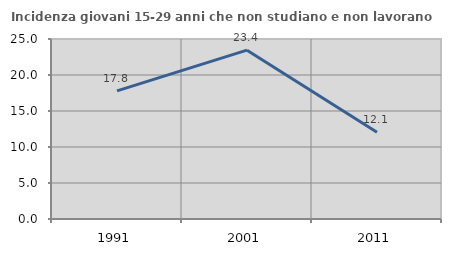
| Category | Incidenza giovani 15-29 anni che non studiano e non lavorano  |
|---|---|
| 1991.0 | 17.79 |
| 2001.0 | 23.448 |
| 2011.0 | 12.057 |